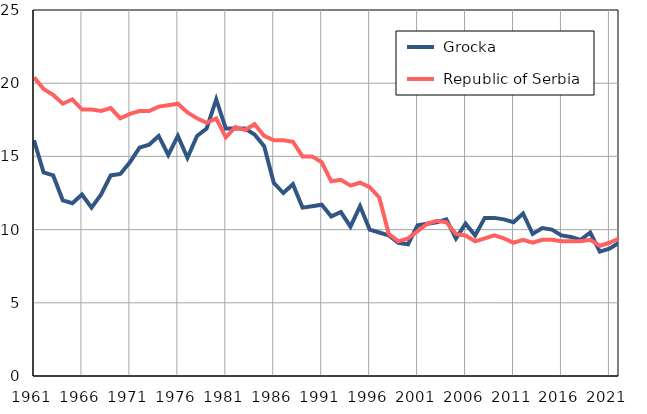
| Category |  Grocka |  Republic of Serbia |
|---|---|---|
| 1961.0 | 16.1 | 20.4 |
| 1962.0 | 13.9 | 19.6 |
| 1963.0 | 13.7 | 19.2 |
| 1964.0 | 12 | 18.6 |
| 1965.0 | 11.8 | 18.9 |
| 1966.0 | 12.4 | 18.2 |
| 1967.0 | 11.5 | 18.2 |
| 1968.0 | 12.4 | 18.1 |
| 1969.0 | 13.7 | 18.3 |
| 1970.0 | 13.8 | 17.6 |
| 1971.0 | 14.6 | 17.9 |
| 1972.0 | 15.6 | 18.1 |
| 1973.0 | 15.8 | 18.1 |
| 1974.0 | 16.4 | 18.4 |
| 1975.0 | 15.1 | 18.5 |
| 1976.0 | 16.4 | 18.6 |
| 1977.0 | 14.9 | 18 |
| 1978.0 | 16.4 | 17.6 |
| 1979.0 | 16.9 | 17.3 |
| 1980.0 | 18.9 | 17.6 |
| 1981.0 | 16.9 | 16.3 |
| 1982.0 | 16.9 | 17 |
| 1983.0 | 16.9 | 16.8 |
| 1984.0 | 16.5 | 17.2 |
| 1985.0 | 15.7 | 16.4 |
| 1986.0 | 13.2 | 16.1 |
| 1987.0 | 12.5 | 16.1 |
| 1988.0 | 13.1 | 16 |
| 1989.0 | 11.5 | 15 |
| 1990.0 | 11.6 | 15 |
| 1991.0 | 11.7 | 14.6 |
| 1992.0 | 10.9 | 13.3 |
| 1993.0 | 11.2 | 13.4 |
| 1994.0 | 10.2 | 13 |
| 1995.0 | 11.6 | 13.2 |
| 1996.0 | 10 | 12.9 |
| 1997.0 | 9.8 | 12.2 |
| 1998.0 | 9.6 | 9.7 |
| 1999.0 | 9.1 | 9.2 |
| 2000.0 | 9 | 9.4 |
| 2001.0 | 10.3 | 9.9 |
| 2002.0 | 10.4 | 10.4 |
| 2003.0 | 10.5 | 10.6 |
| 2004.0 | 10.7 | 10.5 |
| 2005.0 | 9.4 | 9.7 |
| 2006.0 | 10.4 | 9.6 |
| 2007.0 | 9.6 | 9.2 |
| 2008.0 | 10.8 | 9.4 |
| 2009.0 | 10.8 | 9.6 |
| 2010.0 | 10.7 | 9.4 |
| 2011.0 | 10.5 | 9.1 |
| 2012.0 | 11.1 | 9.3 |
| 2013.0 | 9.7 | 9.1 |
| 2014.0 | 10.1 | 9.3 |
| 2015.0 | 10 | 9.3 |
| 2016.0 | 9.6 | 9.2 |
| 2017.0 | 9.5 | 9.2 |
| 2018.0 | 9.3 | 9.2 |
| 2019.0 | 9.8 | 9.3 |
| 2020.0 | 8.5 | 8.9 |
| 2021.0 | 8.7 | 9.1 |
| 2022.0 | 9.1 | 9.4 |